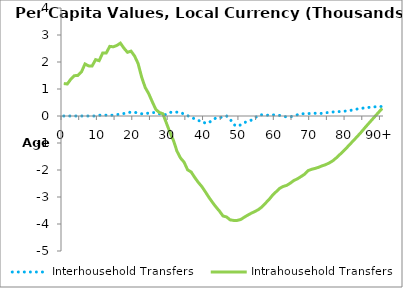
| Category | Interhousehold Transfers | Intrahousehold Transfers |
|---|---|---|
| 0 | 0 | 1202.222 |
|  | 0 | 1185.889 |
| 2 | 0 | 1365.712 |
| 3 | 0 | 1492.797 |
| 4 | 0 | 1503.25 |
| 5 | 0 | 1632.551 |
| 6 | 0 | 1928.337 |
| 7 | 0 | 1856.35 |
| 8 | 0 | 1850.454 |
| 9 | 0 | 2088.228 |
| 10 | 27.891 | 2047.897 |
| 11 | 35.108 | 2332.91 |
| 12 | 31.611 | 2333.15 |
| 13 | 22.912 | 2577.952 |
| 14 | 34.038 | 2563.308 |
| 15 | 49.264 | 2612.711 |
| 16 | 74.109 | 2698.665 |
| 17 | 92.192 | 2511.981 |
| 18 | 123.494 | 2359.556 |
| 19 | 142.057 | 2403.067 |
| 20 | 137.376 | 2223.894 |
| 21 | 109.625 | 1944.367 |
| 22 | 83.69 | 1446.723 |
| 23 | 83.278 | 1059.253 |
| 24 | 108.245 | 828.477 |
| 25 | 128.137 | 530.583 |
| 26 | 125.997 | 247.177 |
| 27 | 84.948 | 130.519 |
| 28 | 44.211 | 83.759 |
| 29 | 54.388 | -259.646 |
| 30 | 132.301 | -605.531 |
| 31 | 146.257 | -908.26 |
| 32 | 142.541 | -1306.604 |
| 33 | 132.199 | -1557.46 |
| 34 | 69.952 | -1710.123 |
| 35 | 11.2 | -1994.356 |
| 36 | -38.058 | -2073.148 |
| 37 | -109.184 | -2274.555 |
| 38 | -171.608 | -2455.648 |
| 39 | -185.458 | -2611.341 |
| 40 | -268.35 | -2804.828 |
| 41 | -245.233 | -3010.123 |
| 42 | -156.978 | -3194.349 |
| 43 | -72.231 | -3367.591 |
| 44 | -68.268 | -3522.697 |
| 45 | -26.665 | -3703.216 |
| 46 | 2.305 | -3737.882 |
| 47 | -111.944 | -3846.68 |
| 48 | -314.61 | -3866.811 |
| 49 | -381.383 | -3866.96 |
| 50 | -328.932 | -3834.39 |
| 51 | -243.878 | -3749.433 |
| 52 | -203.657 | -3672.041 |
| 53 | -153.585 | -3599.847 |
| 54 | -69.93 | -3537.459 |
| 55 | 26.071 | -3468.418 |
| 56 | 44.478 | -3366.858 |
| 57 | 22.361 | -3229.76 |
| 58 | 36.2 | -3093.972 |
| 59 | 43.038 | -2935.767 |
| 60 | 36.558 | -2807.584 |
| 61 | 20.919 | -2680.946 |
| 62 | -6.83 | -2609.261 |
| 63 | -33.77 | -2569.265 |
| 64 | -32.616 | -2488.847 |
| 65 | 4.841 | -2391.689 |
| 66 | 43.803 | -2328.712 |
| 67 | 80.734 | -2247.527 |
| 68 | 85.383 | -2160.997 |
| 69 | 88.239 | -2026.328 |
| 70 | 97.554 | -1975.405 |
| 71 | 101.005 | -1942.701 |
| 72 | 95.305 | -1901.179 |
| 73 | 97.476 | -1845.509 |
| 74 | 119.082 | -1801.799 |
| 75 | 133.644 | -1739.994 |
| 76 | 148.695 | -1662.144 |
| 77 | 155.28 | -1552.522 |
| 78 | 164.602 | -1429.708 |
| 79 | 173.428 | -1301.794 |
| 80 | 188.299 | -1169.907 |
| 81 | 206.08 | -1029.94 |
| 82 | 234.945 | -891.835 |
| 83 | 260.6 | -750.75 |
| 84 | 281.849 | -606.977 |
| 85 | 299.551 | -451.295 |
| 86 | 315.445 | -301.033 |
| 87 | 329.885 | -153.749 |
| 88 | 340.449 | -7.258 |
| 89 | 347.648 | 138.587 |
| 90+ | 352.54 | 284.198 |